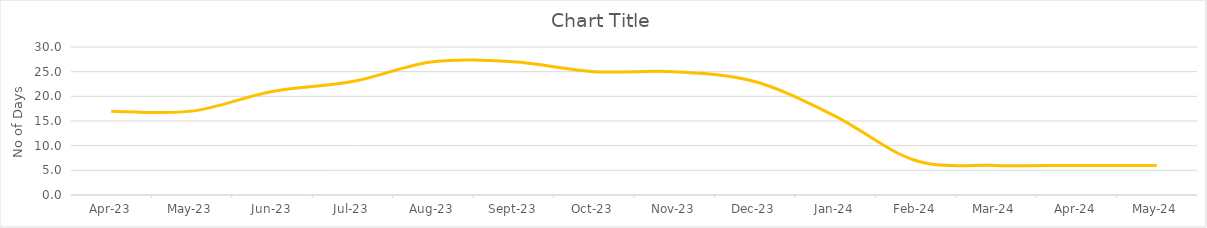
| Category | No of Appointments | No of Appointments made within 14 days | % of Appointments made within 14 days | Average No of Waiting Days for Appointment |
|---|---|---|---|---|
| 2023-04-01 |  |  |  | 17 |
| 2023-05-01 |  |  |  | 17 |
| 2023-06-01 |  |  |  | 21 |
| 2023-07-01 |  |  |  | 23 |
| 2023-08-01 |  |  |  | 27 |
| 2023-09-01 |  |  |  | 27 |
| 2023-10-01 |  |  |  | 25 |
| 2023-11-01 |  |  |  | 25 |
| 2023-12-01 |  |  |  | 23 |
| 2024-01-01 |  |  |  | 16 |
| 2024-02-01 |  |  |  | 7 |
| 2024-03-01 |  |  |  | 6 |
| 2024-04-01 |  |  |  | 6 |
| 2024-05-01 |  |  |  | 6 |